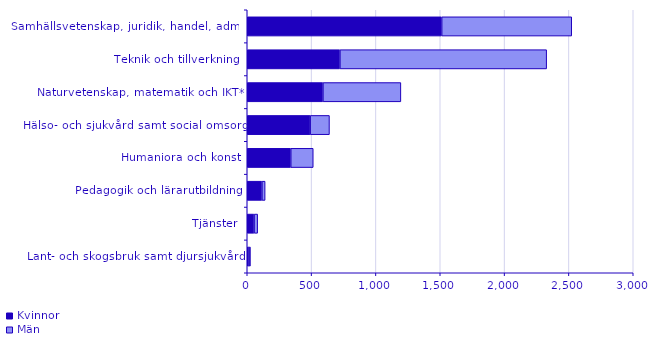
| Category | Kvinnor | Män |
|---|---|---|
| Lant- och skogsbruk samt djursjukvård | 14 | 11 |
| Tjänster | 53 | 28 |
| Pedagogik och lärarutbildning | 114 | 25 |
| Humaniora och konst | 338 | 175 |
| Hälso- och sjukvård samt social omsorg | 489 | 150 |
| Naturvetenskap, matematik och IKT* | 588 | 606 |
| Teknik och tillverkning | 720 | 1607 |
| Samhällsvetenskap, juridik, handel, adm.  | 1511 | 1011 |